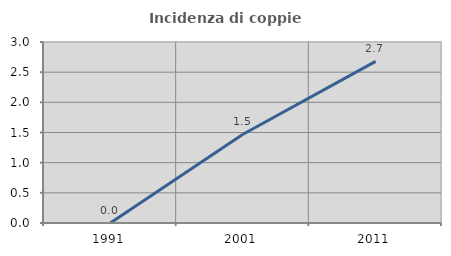
| Category | Incidenza di coppie miste |
|---|---|
| 1991.0 | 0 |
| 2001.0 | 1.471 |
| 2011.0 | 2.679 |